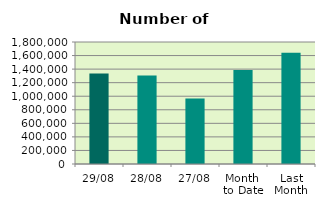
| Category | Series 0 |
|---|---|
| 29/08 | 1336236 |
| 28/08 | 1304548 |
| 27/08 | 964938 |
| Month 
to Date | 1385301.524 |
| Last
Month | 1640369.455 |